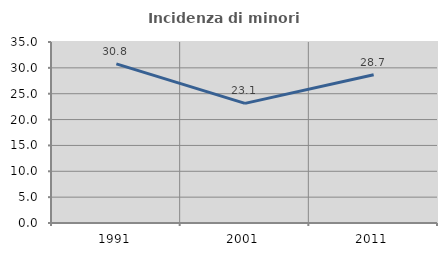
| Category | Incidenza di minori stranieri |
|---|---|
| 1991.0 | 30.769 |
| 2001.0 | 23.129 |
| 2011.0 | 28.678 |